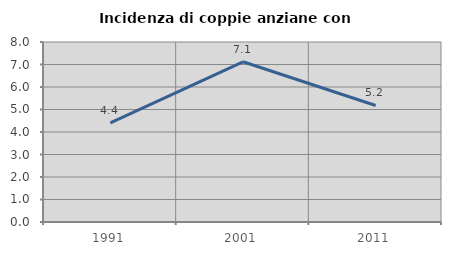
| Category | Incidenza di coppie anziane con figli |
|---|---|
| 1991.0 | 4.408 |
| 2001.0 | 7.122 |
| 2011.0 | 5.178 |